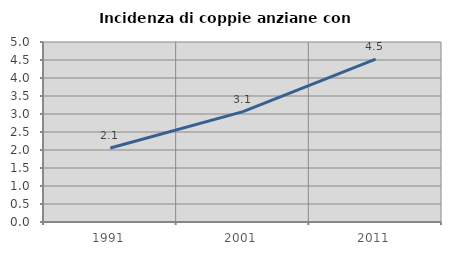
| Category | Incidenza di coppie anziane con figli |
|---|---|
| 1991.0 | 2.055 |
| 2001.0 | 3.065 |
| 2011.0 | 4.522 |